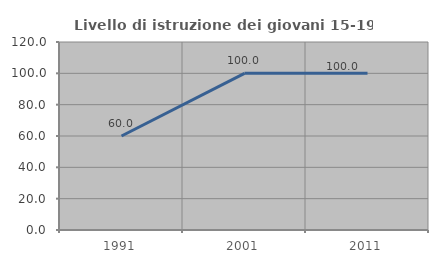
| Category | Livello di istruzione dei giovani 15-19 anni |
|---|---|
| 1991.0 | 60 |
| 2001.0 | 100 |
| 2011.0 | 100 |